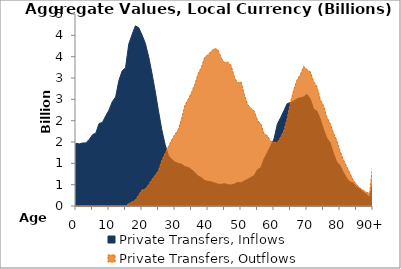
| Category | Private Transfers, Inflows | Private Transfers, Outflows |
|---|---|---|
| 0 | 1468.168 | 0 |
|  | 1455.327 | 0 |
| 2 | 1477.263 | 0 |
| 3 | 1478.345 | 0 |
| 4 | 1560.04 | 0 |
| 5 | 1670.113 | 0 |
| 6 | 1708.879 | 0 |
| 7 | 1933.777 | 0 |
| 8 | 1958.003 | 0 |
| 9 | 2109.521 | 0 |
| 10 | 2248.685 | 0 |
| 11 | 2445.696 | 0 |
| 12 | 2553.392 | 0 |
| 13 | 2942.944 | 0 |
| 14 | 3168.73 | 0 |
| 15 | 3239.059 | 0 |
| 16 | 3797.781 | 54.761 |
| 17 | 4020.391 | 95.279 |
| 18 | 4222.893 | 138.332 |
| 19 | 4179.56 | 254.127 |
| 20 | 4010.287 | 376.166 |
| 21 | 3815.64 | 396.924 |
| 22 | 3506.623 | 497.989 |
| 23 | 3118.803 | 617.963 |
| 24 | 2692.505 | 719.864 |
| 25 | 2225.808 | 829.759 |
| 26 | 1786.797 | 1065.288 |
| 27 | 1445.095 | 1232.277 |
| 28 | 1178.502 | 1390.898 |
| 29 | 1091.71 | 1548.078 |
| 30 | 1027.812 | 1677.87 |
| 31 | 998.334 | 1790.503 |
| 32 | 979.529 | 2044.174 |
| 33 | 921.46 | 2357.234 |
| 34 | 905.21 | 2501.766 |
| 35 | 851.516 | 2659.417 |
| 36 | 784.702 | 2848.025 |
| 37 | 700.64 | 3098.003 |
| 38 | 664.55 | 3247.877 |
| 39 | 596.185 | 3485.428 |
| 40 | 578.954 | 3542.535 |
| 41 | 563.809 | 3630.158 |
| 42 | 541.145 | 3690.31 |
| 43 | 510.717 | 3663.938 |
| 44 | 508.154 | 3467.809 |
| 45 | 522.35 | 3363.894 |
| 46 | 499.204 | 3374.337 |
| 47 | 491.393 | 3293.513 |
| 48 | 514.654 | 3019.206 |
| 49 | 554.564 | 2881.644 |
| 50 | 540.992 | 2909.245 |
| 51 | 588.195 | 2610.058 |
| 52 | 626.47 | 2381.987 |
| 53 | 667.302 | 2286.28 |
| 54 | 714.105 | 2227.116 |
| 55 | 851.841 | 2006.444 |
| 56 | 893.631 | 1924.024 |
| 57 | 1102.972 | 1692.595 |
| 58 | 1254.031 | 1647.687 |
| 59 | 1406.699 | 1512.624 |
| 60 | 1572.609 | 1496.101 |
| 61 | 1915.49 | 1483.315 |
| 62 | 2070.149 | 1608.857 |
| 63 | 2233.746 | 1766.012 |
| 64 | 2399.382 | 2047.917 |
| 65 | 2426.467 | 2429.948 |
| 66 | 2457.934 | 2726.61 |
| 67 | 2512.264 | 2956.718 |
| 68 | 2534.58 | 3081.061 |
| 69 | 2556.589 | 3270.749 |
| 70 | 2615.08 | 3194.453 |
| 71 | 2504.096 | 3146.693 |
| 72 | 2272.701 | 2916.32 |
| 73 | 2225.692 | 2800.768 |
| 74 | 2038.27 | 2499.315 |
| 75 | 1796.175 | 2352.068 |
| 76 | 1591.145 | 2086.711 |
| 77 | 1483.518 | 1934.502 |
| 78 | 1235.883 | 1717.093 |
| 79 | 1033.574 | 1541.834 |
| 80 | 949.057 | 1284.319 |
| 81 | 789.947 | 1090.019 |
| 82 | 652.766 | 929.238 |
| 83 | 568.004 | 767.579 |
| 84 | 537.205 | 606.916 |
| 85 | 442.705 | 508.243 |
| 86 | 401.418 | 423.393 |
| 87 | 329.275 | 371.469 |
| 88 | 277.682 | 323.487 |
| 89 | 207.164 | 296.945 |
| 90+ | 582.785 | 1034.755 |